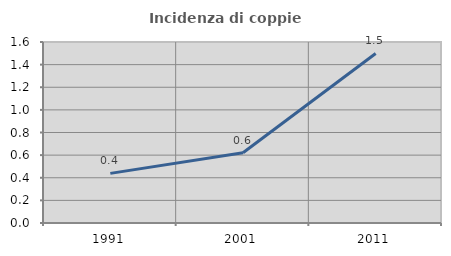
| Category | Incidenza di coppie miste |
|---|---|
| 1991.0 | 0.439 |
| 2001.0 | 0.621 |
| 2011.0 | 1.499 |